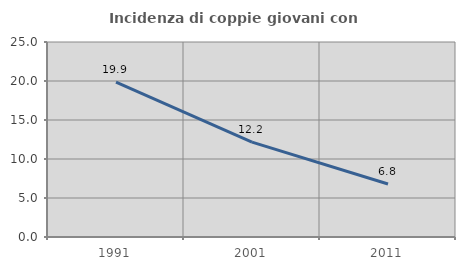
| Category | Incidenza di coppie giovani con figli |
|---|---|
| 1991.0 | 19.862 |
| 2001.0 | 12.158 |
| 2011.0 | 6.797 |